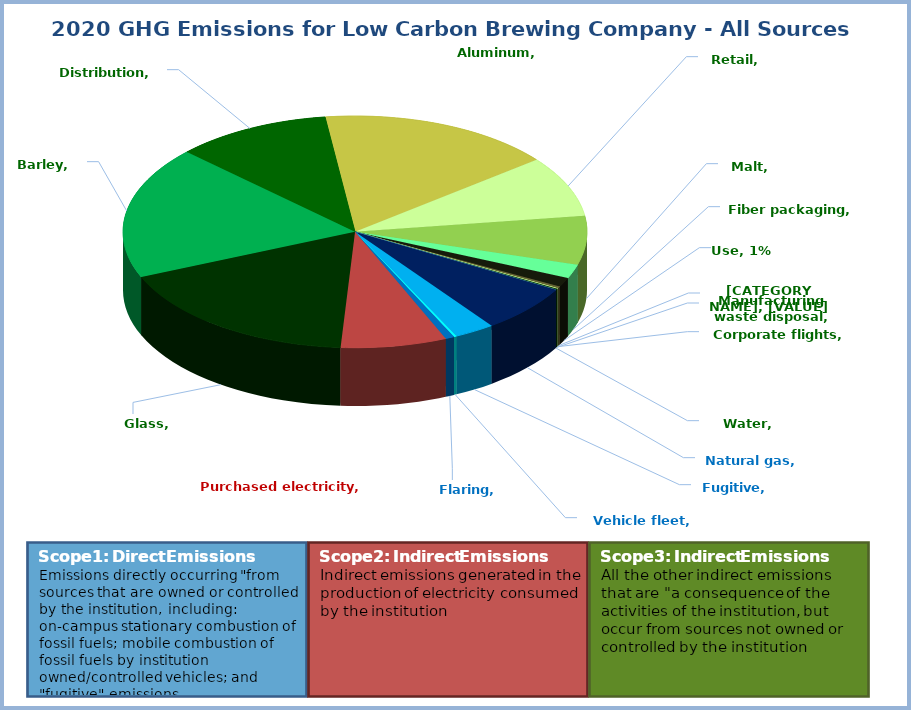
| Category | Series 0 |
|---|---|
| Natural gas | 0.067 |
| Fugitive | 0.028 |
| Vehicle fleet | 0.002 |
| Flaring | 0.006 |
| Purchased electricity | 0.074 |
| Glass | 0.176 |
| Barley | 0.185 |
| Distribution | 0.108 |
| Aluminum | 0.164 |
| Retail | 0.085 |
| Malt | 0.068 |
| Fiber packaging | 0.02 |
| Use | 0.013 |
| Carbon dioxide purchases | 0.003 |
| Corporate flights | 0.001 |
| Manufacturing waste disposal | 0.002 |
| Water | 0 |